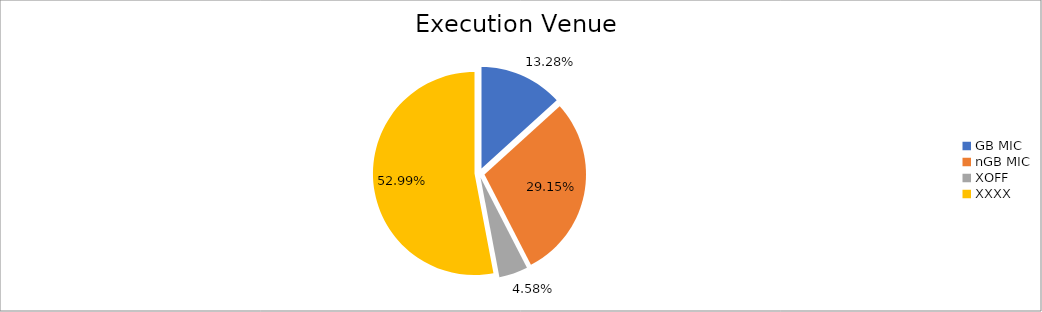
| Category | Series 0 |
|---|---|
| GB MIC | 1247534.925 |
| nGB MIC | 2738565.597 |
| XOFF | 429844.445 |
| XXXX | 4977968.232 |